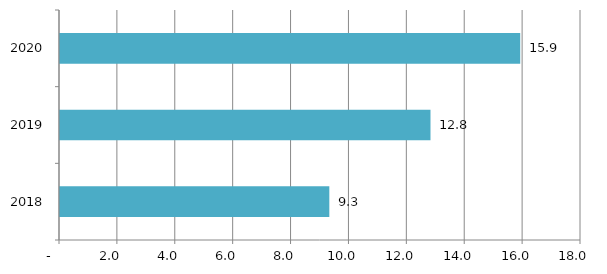
| Category | Series 0 |
|---|---|
| 2018.0 | 9.305 |
| 2019.0 | 12.8 |
| 2020.0 | 15.9 |